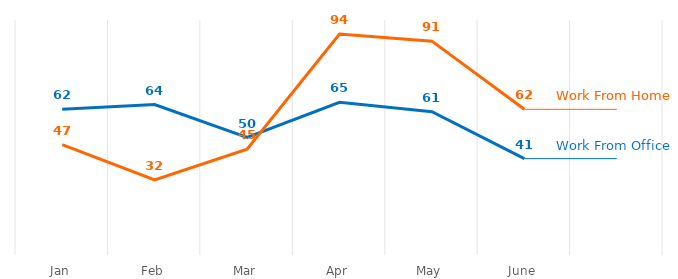
| Category | Series 0 | Series 1 |
|---|---|---|
| Jan | 62 | 47 |
| Feb | 64 | 32 |
| Mar | 50 | 45 |
| Apr | 65 | 94 |
| May | 61 | 91 |
| June | 41 | 62 |